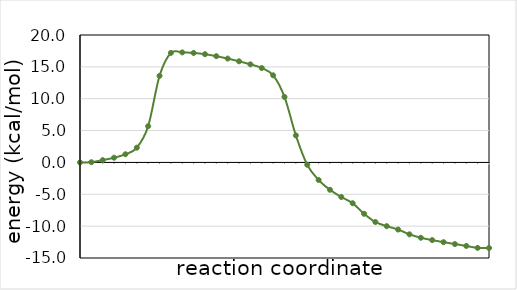
| Category | Series 0 |
|---|---|
| 1.0 | 0 |
| 2.0 | 0.037 |
| 3.0 | 0.362 |
| 4.0 | 0.738 |
| 5.0 | 1.283 |
| 6.0 | 2.312 |
| 7.0 | 5.696 |
| 8.0 | 13.585 |
| 9.0 | 17.187 |
| 10.0 | 17.269 |
| 11.0 | 17.183 |
| 12.0 | 16.989 |
| 13.0 | 16.674 |
| 14.0 | 16.3 |
| 15.0 | 15.87 |
| 16.0 | 15.394 |
| 17.0 | 14.813 |
| 18.0 | 13.671 |
| 19.0 | 10.28 |
| 20.0 | 4.246 |
| 21.0 | -0.367 |
| 22.0 | -2.75 |
| 23.0 | -4.293 |
| 24.0 | -5.427 |
| 25.0 | -6.405 |
| 26.0 | -8.057 |
| 27.0 | -9.351 |
| 28.0 | -10.003 |
| 29.0 | -10.536 |
| 30.0 | -11.284 |
| 31.0 | -11.822 |
| 32.0 | -12.19 |
| 33.0 | -12.513 |
| 34.0 | -12.812 |
| 35.0 | -13.107 |
| 36.0 | -13.417 |
| 37.0 | -13.429 |